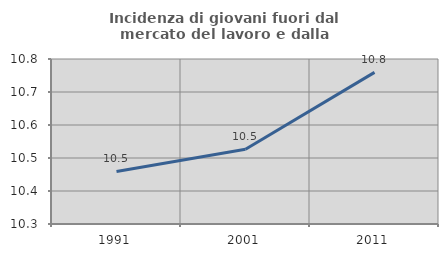
| Category | Incidenza di giovani fuori dal mercato del lavoro e dalla formazione  |
|---|---|
| 1991.0 | 10.459 |
| 2001.0 | 10.526 |
| 2011.0 | 10.759 |